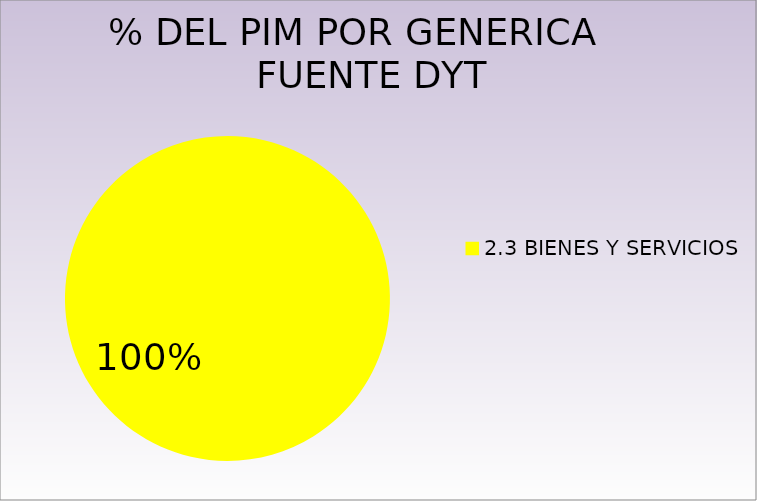
| Category | Series 0 |
|---|---|
| 2.3 BIENES Y SERVICIOS | 3218011 |